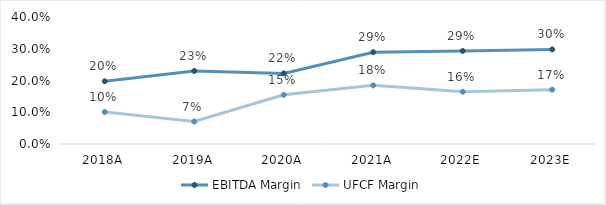
| Category | EBITDA Margin | UFCF Margin |
|---|---|---|
| 2018.0 | 0.198 | 0.101 |
| 2019.0 | 0.23 | 0.071 |
| 2020.0 | 0.222 | 0.155 |
| 2021.0 | 0.289 | 0.185 |
| 2022.0 | 0.293 | 0.165 |
| 2023.0 | 0.298 | 0.171 |